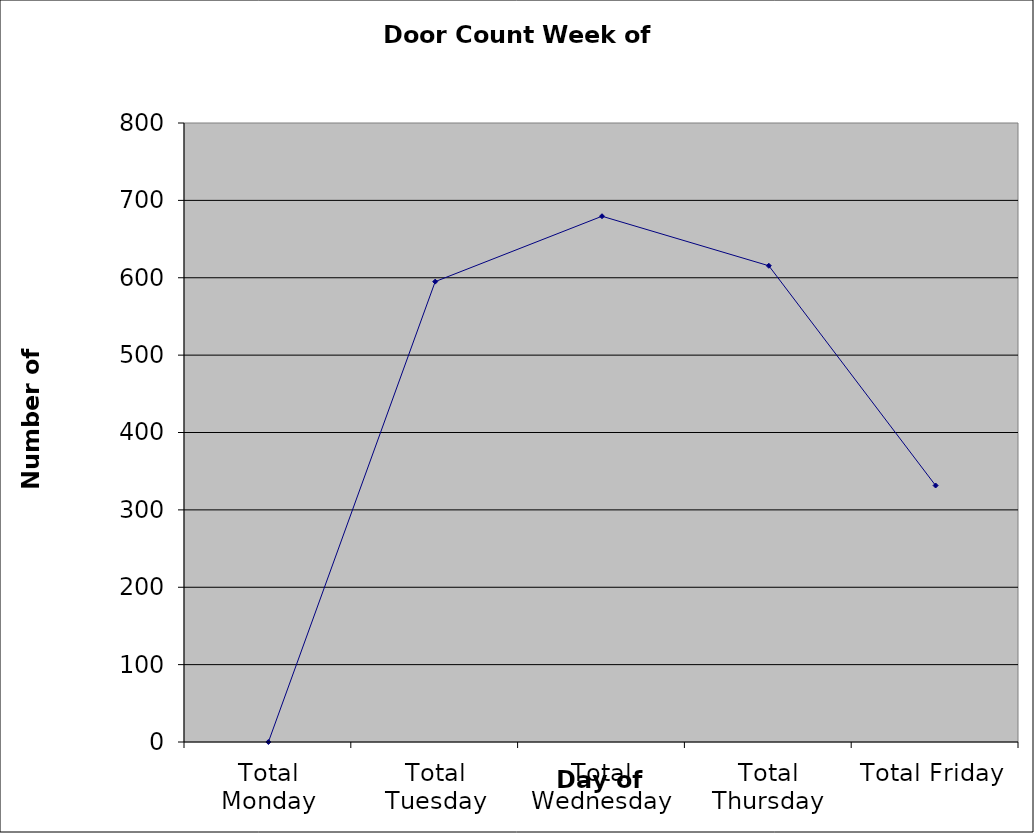
| Category | Series 0 |
|---|---|
| Total Monday | 0 |
| Total Tuesday | 595 |
| Total Wednesday | 679.5 |
| Total Thursday | 615.5 |
| Total Friday | 331.5 |